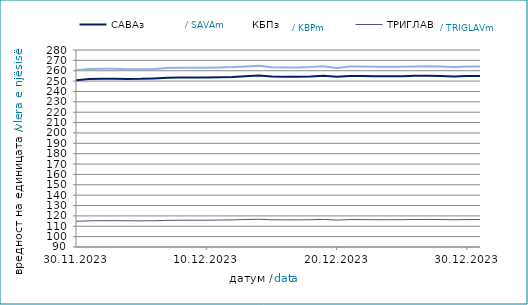
| Category | САВАз | КБПз | ТРИГЛАВз |
|---|---|---|---|
| 2023-11-30 | 250.905 | 260.571 | 114.792 |
| 2023-12-01 | 252.001 | 261.577 | 115.24 |
| 2023-12-02 | 252.345 | 261.968 | 115.412 |
| 2023-12-03 | 252.36 | 261.984 | 115.42 |
| 2023-12-04 | 252.136 | 261.534 | 115.275 |
| 2023-12-05 | 252.202 | 261.516 | 115.238 |
| 2023-12-06 | 252.547 | 261.76 | 115.339 |
| 2023-12-07 | 253.153 | 262.525 | 115.664 |
| 2023-12-08 | 253.421 | 262.848 | 115.822 |
| 2023-12-09 | 253.436 | 262.864 | 115.83 |
| 2023-12-10 | 253.451 | 262.879 | 115.838 |
| 2023-12-11 | 253.667 | 263.118 | 115.994 |
| 2023-12-12 | 253.913 | 263.487 | 116.148 |
| 2023-12-13 | 254.716 | 264.185 | 116.487 |
| 2023-12-14 | 255.333 | 264.82 | 116.782 |
| 2023-12-15 | 254.393 | 263.393 | 116.241 |
| 2023-12-16 | 254.247 | 263.223 | 116.169 |
| 2023-12-17 | 254.263 | 263.238 | 116.177 |
| 2023-12-18 | 254.446 | 263.57 | 116.29 |
| 2023-12-19 | 255.231 | 264.315 | 116.623 |
| 2023-12-20 | 254.168 | 262.755 | 115.955 |
| 2023-12-21 | 254.956 | 264.003 | 116.451 |
| 2023-12-22 | 254.908 | 263.974 | 116.416 |
| 2023-12-23 | 254.702 | 263.731 | 116.311 |
| 2023-12-24 | 254.718 | 263.746 | 116.319 |
| 2023-12-25 | 254.682 | 263.752 | 116.323 |
| 2023-12-26 | 255.056 | 264.198 | 116.523 |
| 2023-12-27 | 255.24 | 264.343 | 116.584 |
| 2023-12-28 | 255.003 | 264.082 | 116.462 |
| 2023-12-29 | 254.55 | 263.674 | 116.261 |
| 2023-12-30 | 254.954 | 264.126 | 116.456 |
| 2023-12-31 | 254.97 | 264.141 | 116.464 |